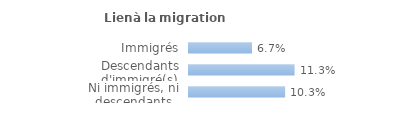
| Category | Series 0 |
|---|---|
| Immigrés | 0.067 |
| Descendants d'immigré(s) | 0.113 |
| Ni immigrés, ni descendants | 0.103 |